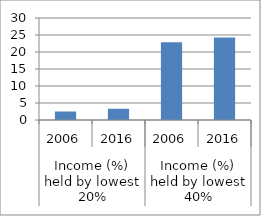
| Category | Series 0 |
|---|---|
| 0 | 2.5 |
| 1 | 3.3 |
| 2 | 22.9 |
| 3 | 24.3 |